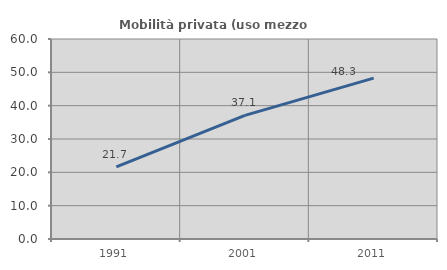
| Category | Mobilità privata (uso mezzo privato) |
|---|---|
| 1991.0 | 21.658 |
| 2001.0 | 37.097 |
| 2011.0 | 48.268 |